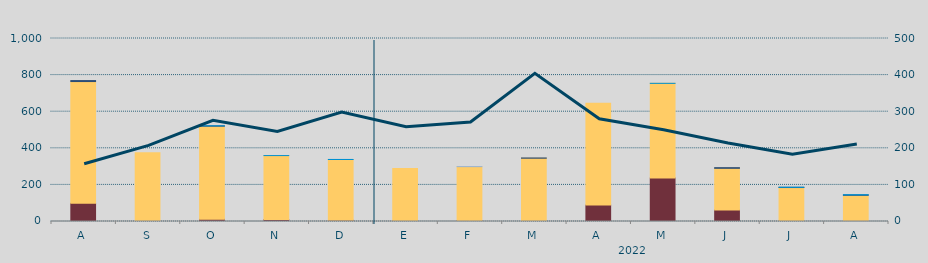
| Category | Carbón | Ciclo Combinado | Cogeneración | Consumo Bombeo | Eólica | Hidráulica | Otras Renovables | Solar fotovoltaica | Solar térmica | Turbinación bombeo | Nuclear |
|---|---|---|---|---|---|---|---|---|---|---|---|
| A | 99208.5 | 665537.8 | 0 | 5384.9 | 0 | 0 | 0 | 0 | 0 | 0 | 0 |
| S | 634 | 375205.9 | 0 | 0 | 0 | 0 | 0 | 0 | 0 | 0 | 0 |
| O | 12750 | 508119.2 | 0 | 1625.9 | 0 | 597.8 | 0 | 0 | 0 | 0 | 0 |
| N | 11251 | 348916.7 | 0 | 0 | 0 | 100 | 0 | 0 | 0 | 0 | 0 |
| D | 6493 | 332239.3 | 0 | 0 | 0 | 335 | 0 | 0 | 0 | 0 | 0 |
| E | 4320 | 285393.5 | 0 | 0 | 0 | 0 | 0 | 0 | 0 | 0 | 0 |
| F | 5118.6 | 294678.7 | 0 | 0 | 0 | 0 | 0 | 0 | 0 | 84.5 | 0 |
| M | 280 | 345584.7 | 0 | 1304.2 | 0 | 0 | 0 | 0 | 0 | 0 | 0 |
| A | 89745.4 | 556069.1 | 0 | 0 | 0 | 0 | 0 | 0 | 0 | 0 | 0 |
| M | 238246.1 | 516625.8 | 0 | 0 | 0 | 170 | 0 | 0 | 0 | 0 | 0 |
| J | 63431.6 | 227120.9 | 0 | 3696.9 | 0 | 0 | 0 | 0 | 0 | 0 | 0 |
| J | 347.9 | 185242.2 | 0 | 1000 | 0 | 958 | 0 | 0 | 0 | 0 | 0 |
| A | 0 | 142890.1 | 241.5 | 1836 | 0 | 1759 | 0 | 0 | 0 | 0 | 0 |